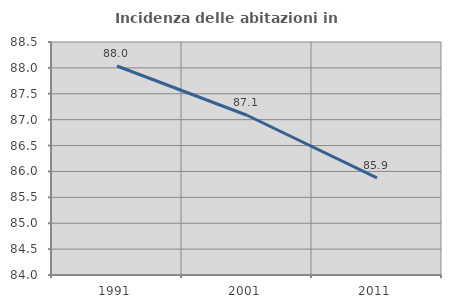
| Category | Incidenza delle abitazioni in proprietà  |
|---|---|
| 1991.0 | 88.036 |
| 2001.0 | 87.085 |
| 2011.0 | 85.877 |